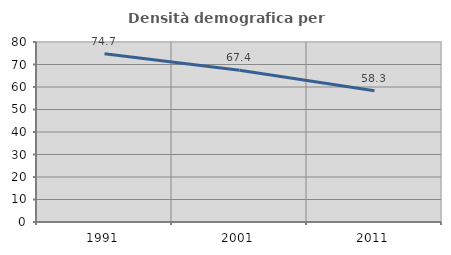
| Category | Densità demografica |
|---|---|
| 1991.0 | 74.745 |
| 2001.0 | 67.44 |
| 2011.0 | 58.288 |